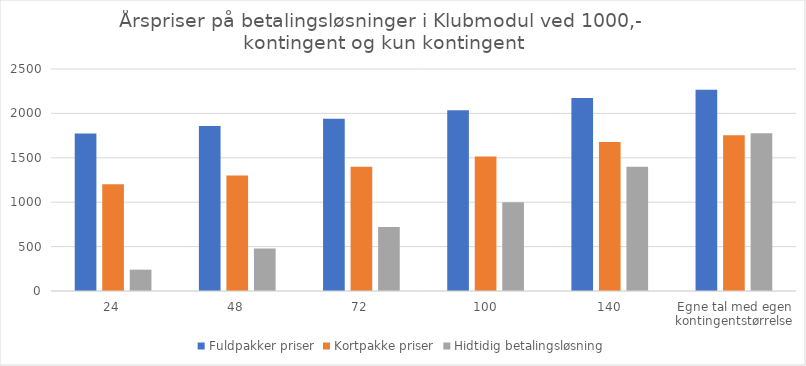
| Category | Fuldpakker priser | Kortpakke priser | Hidtidig betalingsløsning |
|---|---|---|---|
| 24 | 1774.68 | 1202.52 | 240 |
| 48 | 1857.36 | 1301.04 | 480 |
| 72 | 1940.04 | 1399.56 | 720 |
| 100 | 2036.5 | 1514.5 | 1000 |
| 140 | 2174.3 | 1678.7 | 1400 |
| Egne tal med egen kontingentstørrelse | 2266.74 | 1754.96 | 1776 |